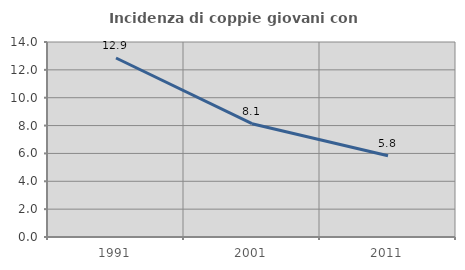
| Category | Incidenza di coppie giovani con figli |
|---|---|
| 1991.0 | 12.853 |
| 2001.0 | 8.134 |
| 2011.0 | 5.829 |